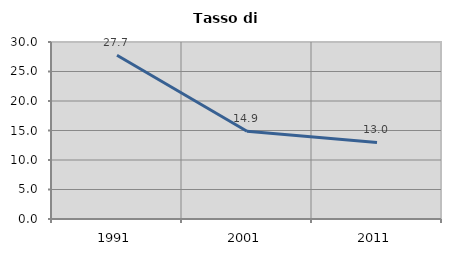
| Category | Tasso di disoccupazione   |
|---|---|
| 1991.0 | 27.743 |
| 2001.0 | 14.865 |
| 2011.0 | 12.971 |